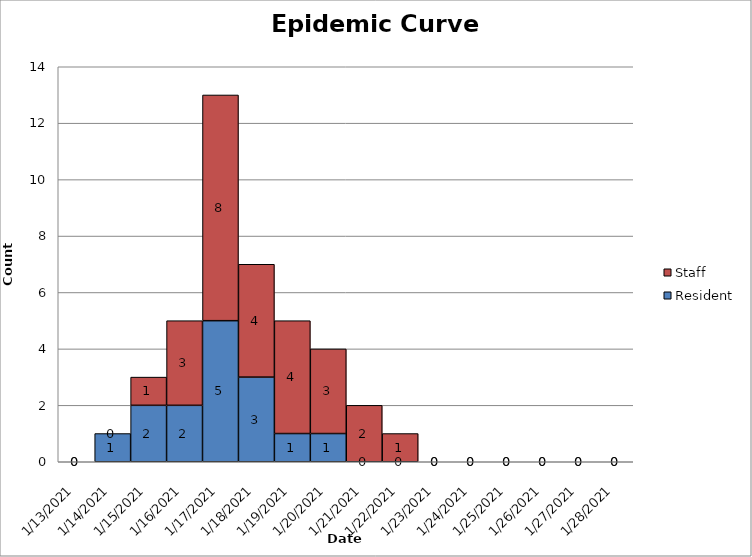
| Category | Resident | Staff |
|---|---|---|
| 1/13/21 | 0 | 0 |
| 1/14/21 | 1 | 0 |
| 1/15/21 | 2 | 1 |
| 1/16/21 | 2 | 3 |
| 1/17/21 | 5 | 8 |
| 1/18/21 | 3 | 4 |
| 1/19/21 | 1 | 4 |
| 1/20/21 | 1 | 3 |
| 1/21/21 | 0 | 2 |
| 1/22/21 | 0 | 1 |
| 1/23/21 | 0 | 0 |
| 1/24/21 | 0 | 0 |
| 1/25/21 | 0 | 0 |
| 1/26/21 | 0 | 0 |
| 1/27/21 | 0 | 0 |
| 1/28/21 | 0 | 0 |